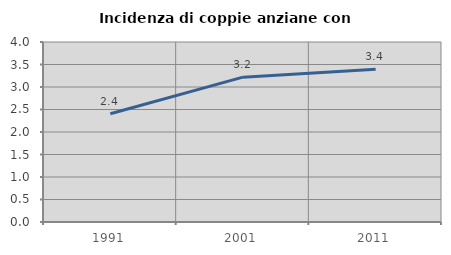
| Category | Incidenza di coppie anziane con figli |
|---|---|
| 1991.0 | 2.407 |
| 2001.0 | 3.219 |
| 2011.0 | 3.396 |